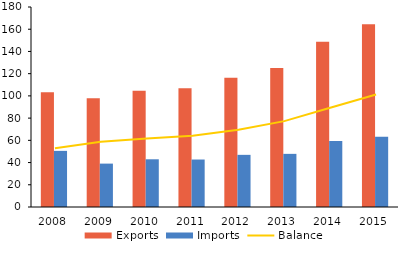
| Category | Exports | Imports |
|---|---|---|
| 2008.0 | 103.365 | 50.516 |
| 2009.0 | 97.77 | 39.052 |
| 2010.0 | 104.696 | 42.941 |
| 2011.0 | 106.9 | 42.728 |
| 2012.0 | 116.388 | 46.936 |
| 2013.0 | 125.103 | 47.828 |
| 2014.0 | 148.625 | 59.33 |
| 2015.0 | 164.462 | 63.286 |